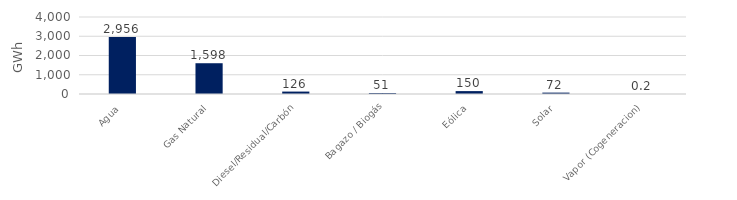
| Category | Series 0 |
|---|---|
| Agua | 2956.383 |
| Gas Natural | 1598.495 |
| Diesel/Residual/Carbón | 125.895 |
| Bagazo / Biogás | 51.471 |
| Eólica | 150.477 |
| Solar | 71.794 |
| Vapor (Cogeneracion) | 0.245 |